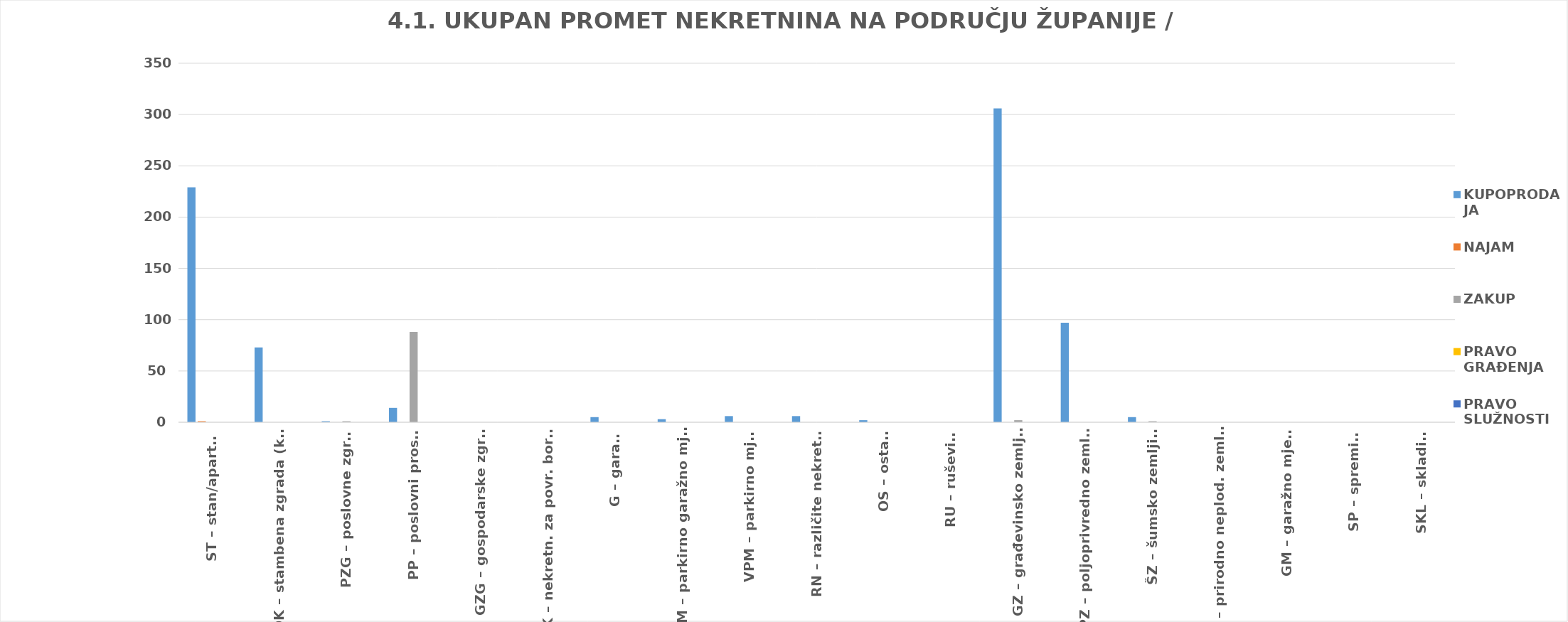
| Category | KUPOPRODAJA | NAJAM | ZAKUP | PRAVO GRAĐENJA | PRAVO SLUŽNOSTI |
|---|---|---|---|---|---|
| ST – stan/apartman | 229 | 1 | 0 | 0 | 0 |
| OK – stambena zgrada (kuća) | 73 | 0 | 0 | 0 | 0 |
| PZG – poslovne zgrade | 1 | 0 | 1 | 0 | 0 |
| PP – poslovni prostori | 14 | 0 | 88 | 0 | 0 |
| GZG – gospodarske zgrade | 0 | 0 | 0 | 0 | 0 |
| VIK – nekretn. za povr. boravak | 0 | 0 | 0 | 0 | 0 |
| G – garaža | 5 | 0 | 0 | 0 | 0 |
| PGM – parkirno garažno mjesto | 3 | 0 | 0 | 0 | 0 |
| VPM – parkirno mjesto | 6 | 0 | 0 | 0 | 0 |
| RN – različite nekretnine | 6 | 0 | 0 | 0 | 0 |
| OS – ostalo | 2 | 0 | 0 | 0 | 0 |
| RU – ruševine | 0 | 0 | 0 | 0 | 0 |
| GZ – građevinsko zemljište | 306 | 0 | 2 | 0 | 0 |
| PZ – poljoprivredno zemljište | 97 | 0 | 0 | 0 | 0 |
| ŠZ – šumsko zemljište | 5 | 0 | 1 | 0 | 0 |
| PNZ – prirodno neplod. zemljište | 0 | 0 | 0 | 0 | 0 |
| GM – garažno mjesto | 0 | 0 | 0 | 0 | 0 |
| SP – spremište | 0 | 0 | 0 | 0 | 0 |
| SKL – skladište | 0 | 0 | 0 | 0 | 0 |